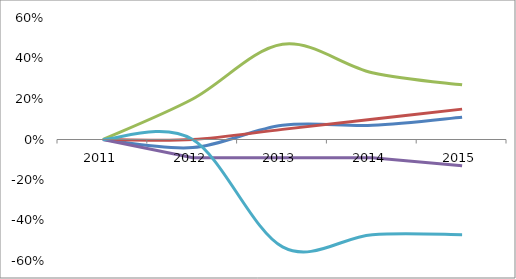
| Category | Fixed Cost | Freight & Forwarding | Other variable cost | Power & Fuel | Profit |
|---|---|---|---|---|---|
| 2011.0 | 0 | 0 | 0 | 0 | 0 |
| 2012.0 | -0.04 | 0 | 0.2 | -0.09 | 0 |
| 2013.0 | 0.07 | 0.05 | 0.47 | -0.09 | -0.53 |
| 2014.0 | 0.07 | 0.1 | 0.33 | -0.09 | -0.47 |
| 2015.0 | 0.11 | 0.15 | 0.27 | -0.13 | -0.47 |